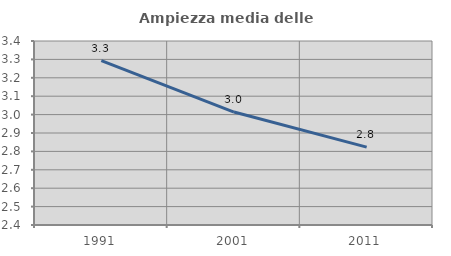
| Category | Ampiezza media delle famiglie |
|---|---|
| 1991.0 | 3.294 |
| 2001.0 | 3.014 |
| 2011.0 | 2.823 |